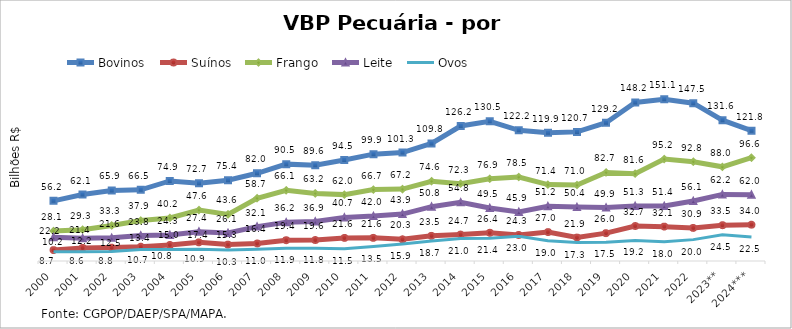
| Category | Bovinos | Suínos | Frango | Leite | Ovos |
|---|---|---|---|---|---|
| 2000 | 56.192 | 10.174 | 28.068 | 22.195 | 8.678 |
| 2001 | 62.115 | 12.207 | 29.293 | 21.358 | 8.552 |
| 2002 | 65.916 | 12.511 | 33.264 | 21.627 | 8.811 |
| 2003 | 66.526 | 13.371 | 37.868 | 23.816 | 10.657 |
| 2004 | 74.85 | 15.033 | 40.236 | 24.341 | 10.801 |
| 2005 | 72.669 | 17.429 | 47.622 | 27.377 | 10.875 |
| 2006 | 75.448 | 15.332 | 43.568 | 26.149 | 10.33 |
| 2007 | 81.995 | 16.394 | 58.659 | 32.147 | 10.979 |
| 2008 | 90.532 | 19.412 | 66.09 | 36.163 | 11.857 |
| 2009 | 89.587 | 19.623 | 63.175 | 36.869 | 11.822 |
| 2010 | 94.452 | 21.587 | 62.04 | 40.717 | 11.498 |
| 2011 | 99.851 | 21.621 | 66.732 | 41.974 | 13.549 |
| 2012 | 101.339 | 20.301 | 67.202 | 43.861 | 15.883 |
| 2013 | 109.816 | 23.506 | 74.556 | 50.756 | 18.68 |
| 2014 | 126.158 | 24.688 | 72.267 | 54.81 | 20.988 |
| 2015 | 130.5 | 26.384 | 76.925 | 49.475 | 21.37 |
| 2016 | 122.154 | 24.349 | 78.511 | 45.907 | 23.038 |
| 2017 | 119.873 | 27.03 | 71.41 | 51.15 | 18.989 |
| 2018 | 120.676 | 21.89 | 70.994 | 50.39 | 17.268 |
| 2019 | 129.218 | 26.019 | 82.734 | 49.923 | 17.488 |
| 2020 | 148.221 | 32.706 | 81.605 | 51.328 | 19.205 |
| 2021 | 151.146 | 32.123 | 95.24 | 51.384 | 17.997 |
| 2022 | 147.487 | 30.931 | 92.827 | 56.101 | 19.969 |
| 2023** | 131.636 | 33.473 | 88.018 | 62.226 | 24.513 |
| 2024*** | 121.801 | 33.968 | 96.582 | 61.99 | 22.45 |